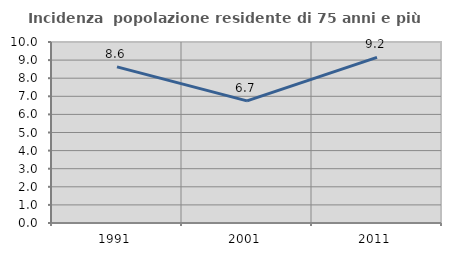
| Category | Incidenza  popolazione residente di 75 anni e più |
|---|---|
| 1991.0 | 8.624 |
| 2001.0 | 6.746 |
| 2011.0 | 9.153 |